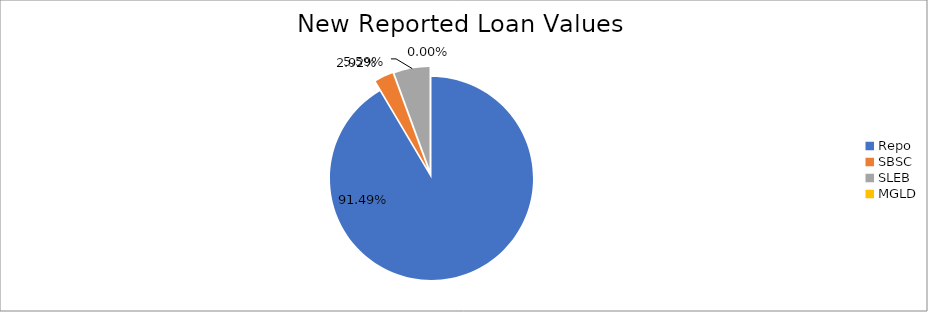
| Category | Series 0 |
|---|---|
| Repo | 9333018.003 |
| SBSC | 297350.037 |
| SLEB | 570194.118 |
| MGLD | 120.059 |